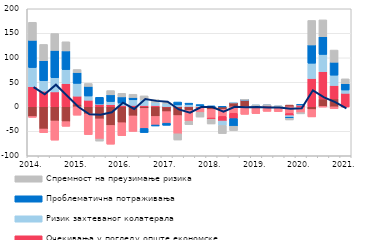
| Category | Трошкови извора за кредите | Конкуренција осталих банака | Очекивања у погледу опште економске ситуације | Ризик захтеваног колатерала | Проблематична потраживања | Спремност на преузимање ризика |
|---|---|---|---|---|---|---|
| 2014. | -19.9 | -1.7 | 41 | 39.1 | 55.5 | 36.9 |
|  | -45.3 | -7.7 | 31.9 | 21.4 | 40.8 | 33.2 |
|  | -29 | -39.1 | 30.4 | 28.9 | 55.7 | 34.4 |
|  | -30.3 | -9.6 | 47.3 | 28.6 | 38.1 | 18.7 |
| 2015. | 5.3 | -17.2 | 16.4 | 26.1 | 22.1 | 6.2 |
|  | -14.5 | -42.3 | 13.3 | 8.7 | 19.6 | 6 |
|  | -24.7 | -41.2 | 5.2 | 0.6 | 13.5 | -4.1 |
|  | -38.1 | -38.3 | 4.2 | 6.5 | 13.7 | 8.7 |
| 2016. | -32.5 | -26.6 | 2.8 | 4.8 | 12.6 | 7.3 |
|  | -18.6 | -31.7 | 2.8 | 11.4 | 4.8 | 6.6 |
|  | -3.2 | -40.9 | 2.6 | 11.7 | -8.5 | 8 |
|  | -19.7 | -17.5 | 2.6 | 6.4 | -2 | 5.6 |
| 2017. | -9.9 | -23.6 | 0.3 | 6.6 | -4.3 | 1.9 |
|  | -17.9 | -37.2 | 0.4 | 3.4 | 5.9 | -12.7 |
|  | -7.4 | -22.4 | 0.6 | 4.3 | 2.5 | -6.8 |
|  | -2.2 | -9.3 | 0.1 | 2.2 | 2.2 | -9.5 |
| 2018. | -5.5 | -17.5 | -2.5 | 0 | 1.9 | -9.6 |
|  | -5.2 | -14.4 | -9.5 | -9.1 | 0.3 | -16.5 |
|  | 8.2 | -13.3 | -10.8 | 0.3 | -15.6 | -8.9 |
|  | 13.5 | -15.5 | 0.1 | 0.3 | 0.3 | 0.1 |
| 2019. | 0 | -14 | 0.1 | 2.4 | 0.3 | 0.1 |
|  | 2.3 | -9.4 | 0.1 | 0.3 | 0.3 | 0.1 |
|  | 0 | -9.9 | 0.1 | 0.4 | 0.4 | 0.1 |
|  | 3.5 | -13.7 | -4.4 | -3.2 | -2.2 | -3.4 |
| 2020. | 0 | -11.9 | 3.7 | 0.4 | 0.4 | -2.6 |
|  | -5.6 | -15.1 | 57.7 | 31.2 | 37.3 | 50 |
|  | 15.9 | -0.1 | 55.9 | 35 | 36.1 | 34.5 |
|  | 16.2 | -4 | 27.2 | 21.1 | 26.4 | 24.9 |
| 2021. | 0 | -0.2 | 27.5 | 6.7 | 12.9 | 10 |